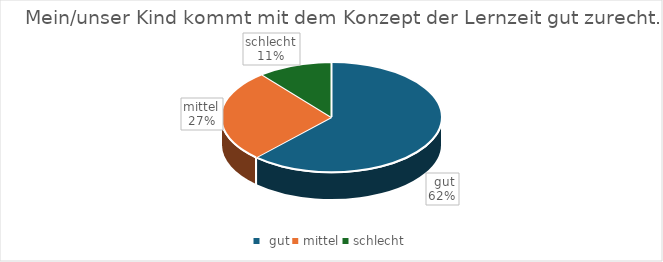
| Category | Series 0 |
|---|---|
|  gut | 57 |
| mittel | 25 |
| schlecht | 10 |